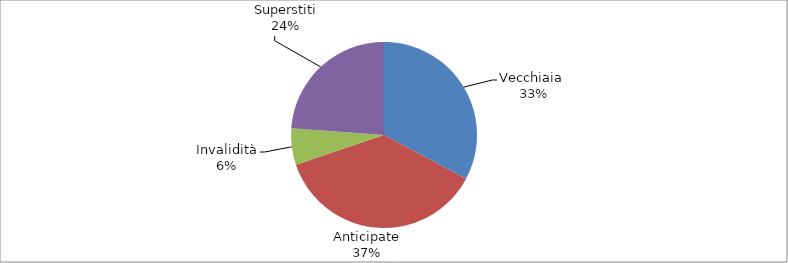
| Category | Series 0 |
|---|---|
| Vecchiaia  | 7097 |
| Anticipate | 8009 |
| Invalidità | 1375 |
| Superstiti | 5161 |